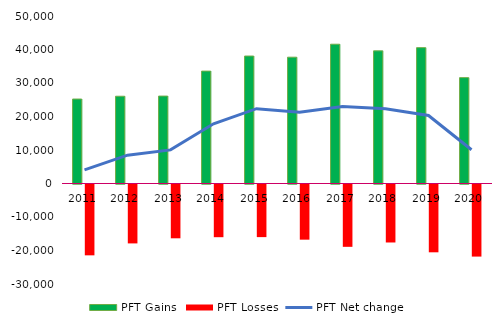
| Category | PFT Gains  | PFT Losses |
|---|---|---|
| 2011.0 | 25211 | -21145 |
| 2012.0 | 26048 | -17585 |
| 2013.0 | 26092 | -16060 |
| 2014.0 | 33545 | -15731 |
| 2015.0 | 38049 | -15707 |
| 2016.0 | 37703 | -16466 |
| 2017.0 | 41575 | -18606 |
| 2018.0 | 39596 | -17309 |
| 2019.0 | 40552 | -20241 |
| 2020.0 | 31603 | -21520 |